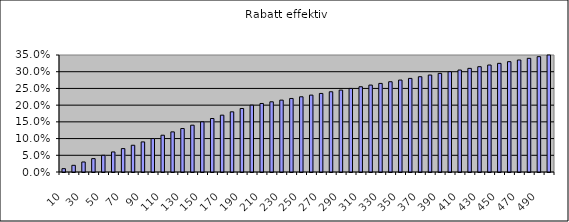
| Category | Rabatt effektiv |
|---|---|
| 10.0 | 0.01 |
| 20.0 | 0.02 |
| 30.0 | 0.03 |
| 40.0 | 0.04 |
| 50.0 | 0.05 |
| 60.0 | 0.06 |
| 70.0 | 0.07 |
| 80.0 | 0.08 |
| 90.0 | 0.09 |
| 100.0 | 0.1 |
| 110.0 | 0.11 |
| 120.0 | 0.12 |
| 130.0 | 0.13 |
| 140.0 | 0.14 |
| 150.0 | 0.15 |
| 160.0 | 0.16 |
| 170.0 | 0.17 |
| 180.0 | 0.18 |
| 190.0 | 0.19 |
| 200.0 | 0.2 |
| 210.0 | 0.205 |
| 220.0 | 0.21 |
| 230.0 | 0.215 |
| 240.0 | 0.22 |
| 250.0 | 0.225 |
| 260.0 | 0.23 |
| 270.0 | 0.235 |
| 280.0 | 0.24 |
| 290.0 | 0.245 |
| 300.0 | 0.25 |
| 310.0 | 0.255 |
| 320.0 | 0.26 |
| 330.0 | 0.265 |
| 340.0 | 0.27 |
| 350.0 | 0.275 |
| 360.0 | 0.28 |
| 370.0 | 0.285 |
| 380.0 | 0.29 |
| 390.0 | 0.295 |
| 400.0 | 0.3 |
| 410.0 | 0.305 |
| 420.0 | 0.31 |
| 430.0 | 0.315 |
| 440.0 | 0.32 |
| 450.0 | 0.325 |
| 460.0 | 0.33 |
| 470.0 | 0.335 |
| 480.0 | 0.34 |
| 490.0 | 0.345 |
| 500.0 | 0.35 |